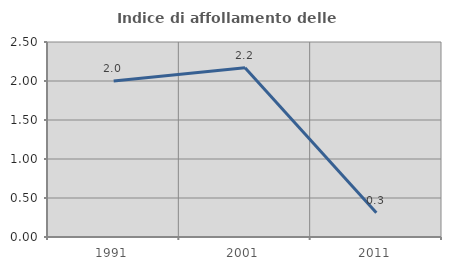
| Category | Indice di affollamento delle abitazioni  |
|---|---|
| 1991.0 | 2 |
| 2001.0 | 2.17 |
| 2011.0 | 0.312 |